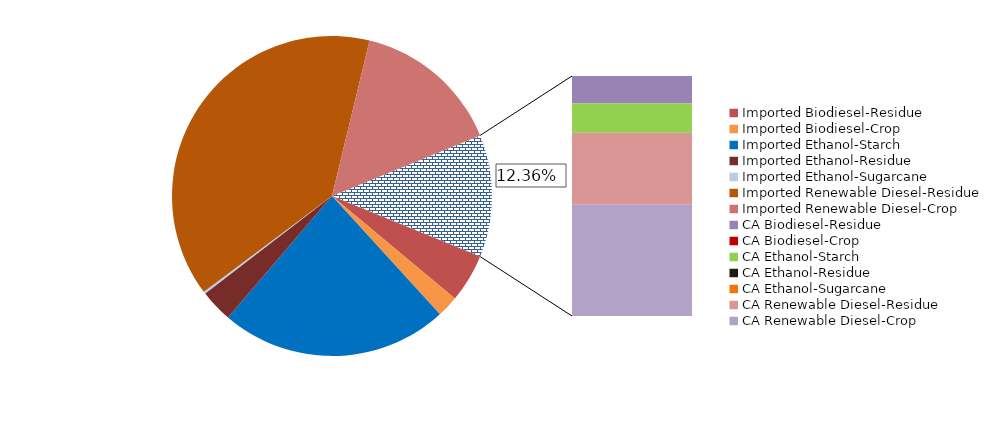
| Category | 2023 |
|---|---|
| Imported Biodiesel-Residue | 169012670.063 |
| Imported Biodiesel-Crop | 75076916.449 |
| Imported Ethanol-Starch | 798450411.889 |
| Imported Ethanol-Residue | 114327987.852 |
| Imported Ethanol-Sugarcane | 7470332.741 |
| Imported Renewable Diesel-Residue | 1351184827.587 |
| Imported Renewable Diesel-Crop | 521439947.264 |
| CA Biodiesel-Residue | 49174484.841 |
| CA Biodiesel-Crop | 55420.758 |
| CA Ethanol-Starch | 51803845.519 |
| CA Ethanol-Residue | 0 |
| CA Ethanol-Sugarcane | 97697.296 |
| CA Renewable Diesel-Residue | 127764078.841 |
| CA Renewable Diesel-Crop | 199245856.961 |